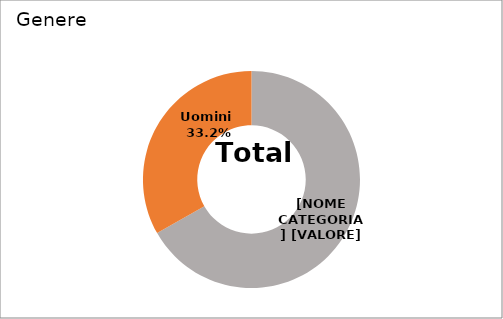
| Category | Series 0 |
|---|---|
| Donne  | 0.668 |
| Uomini  | 0.332 |